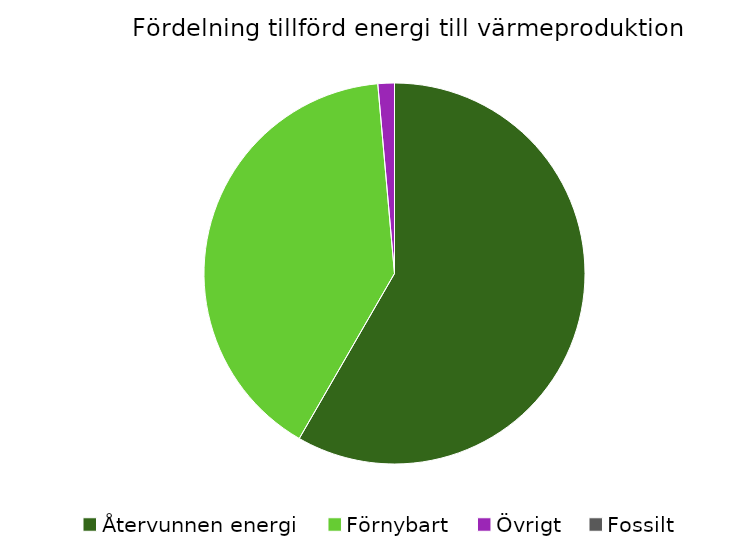
| Category | Fördelning värmeproduktion |
|---|---|
| Återvunnen energi | 0.583 |
| Förnybart | 0.403 |
| Övrigt | 0.014 |
| Fossilt | 0 |